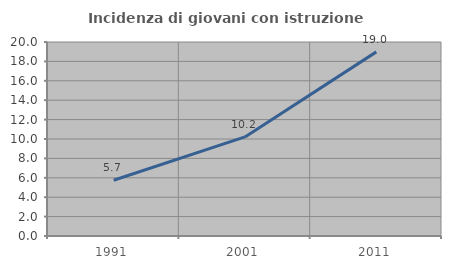
| Category | Incidenza di giovani con istruzione universitaria |
|---|---|
| 1991.0 | 5.745 |
| 2001.0 | 10.214 |
| 2011.0 | 18.982 |